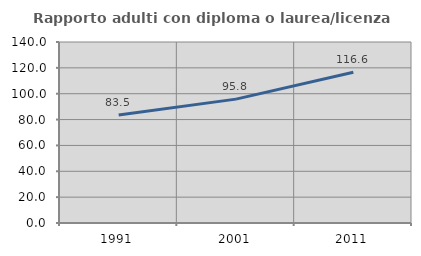
| Category | Rapporto adulti con diploma o laurea/licenza media  |
|---|---|
| 1991.0 | 83.451 |
| 2001.0 | 95.822 |
| 2011.0 | 116.629 |